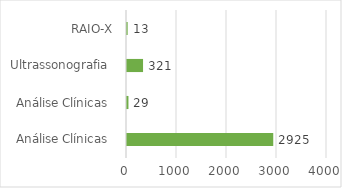
| Category | Series 0 |
|---|---|
| Análise Clínicas  | 2925 |
| Análise Clínicas  | 29 |
| Ultrassonografia  | 321 |
| RAIO-X | 13 |